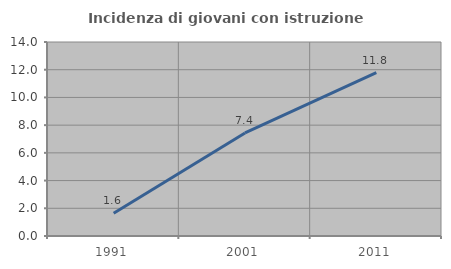
| Category | Incidenza di giovani con istruzione universitaria |
|---|---|
| 1991.0 | 1.635 |
| 2001.0 | 7.434 |
| 2011.0 | 11.786 |